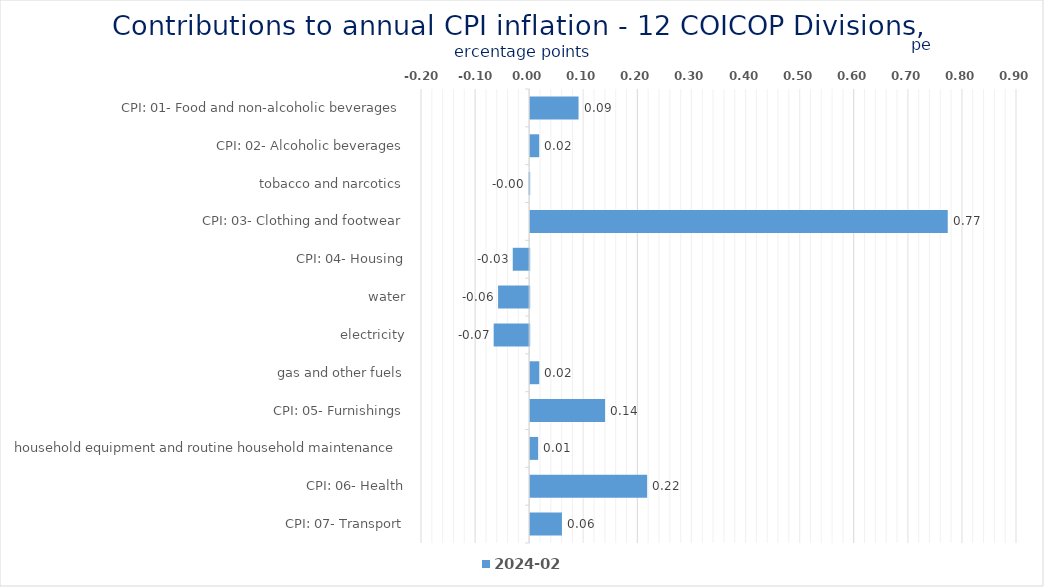
| Category | 2024-02 |
|---|---|
| CPI: 01- Food and non-alcoholic beverages | 0.089 |
| CPI: 02- Alcoholic beverages, tobacco and narcotics | 0.017 |
| CPI: 03- Clothing and footwear | -0.001 |
| CPI: 04- Housing, water, electricity, gas and other fuels | 0.772 |
| CPI: 05- Furnishings, household equipment and routine household maintenance | -0.03 |
| CPI: 06- Health | -0.058 |
| CPI: 07- Transport | -0.066 |
| CPI: 08- Communication | 0.017 |
| CPI: 09- Recreation and culture | 0.138 |
| CPI: 10- Education | 0.015 |
| CPI: 11- Restaurants and hotels | 0.216 |
| CPI: 12- Miscellaneous goods and services | 0.059 |